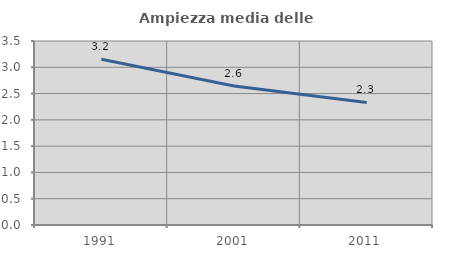
| Category | Ampiezza media delle famiglie |
|---|---|
| 1991.0 | 3.153 |
| 2001.0 | 2.645 |
| 2011.0 | 2.331 |